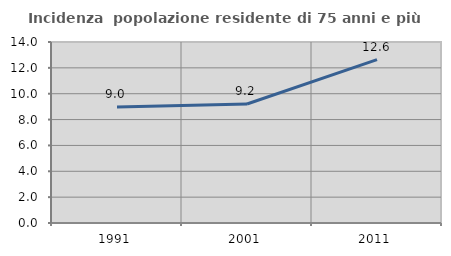
| Category | Incidenza  popolazione residente di 75 anni e più |
|---|---|
| 1991.0 | 8.97 |
| 2001.0 | 9.204 |
| 2011.0 | 12.636 |